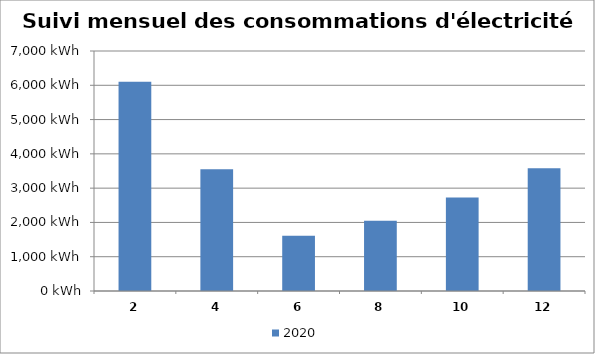
| Category | 2020 |
|---|---|
| 02 | 6100 |
| 04 | 3550 |
| 06 | 1615 |
| 08 | 2050 |
| 10  | 2730 |
| 12  | 3580 |